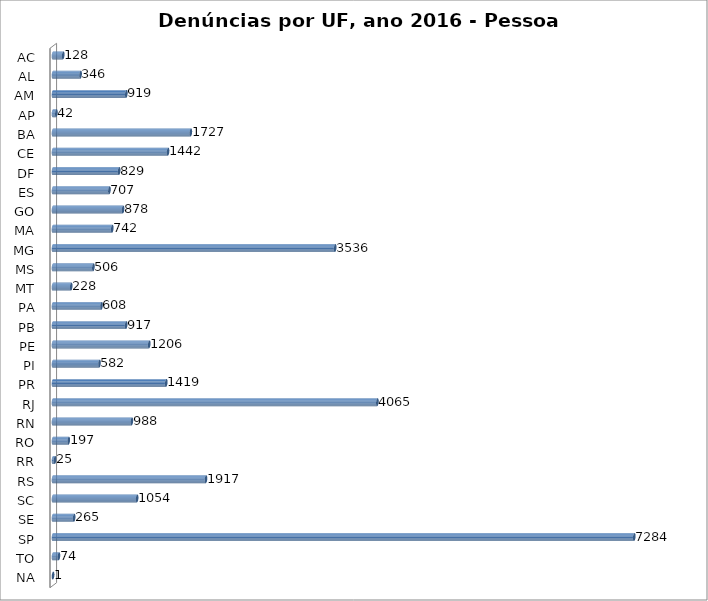
| Category | Series 0 |
|---|---|
| AC | 128 |
| AL | 346 |
| AM | 919 |
| AP | 42 |
| BA | 1727 |
| CE | 1442 |
| DF | 829 |
| ES | 707 |
| GO | 878 |
| MA | 742 |
| MG | 3536 |
| MS | 506 |
| MT | 228 |
| PA | 608 |
| PB | 917 |
| PE | 1206 |
| PI | 582 |
| PR | 1419 |
| RJ | 4065 |
| RN | 988 |
| RO | 197 |
| RR | 25 |
| RS | 1917 |
| SC | 1054 |
| SE | 265 |
| SP | 7284 |
| TO | 74 |
| NA | 1 |